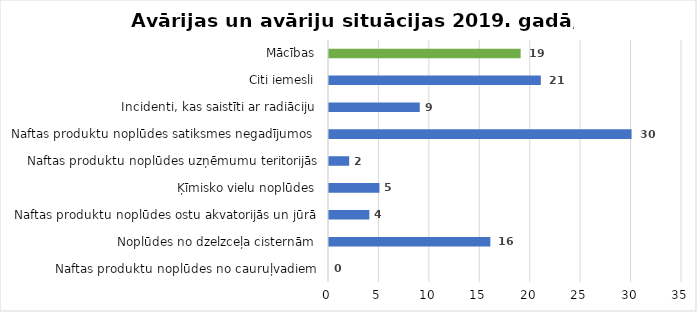
| Category | Series 0 |
|---|---|
| Naftas produktu noplūdes no cauruļvadiem | 0 |
| Noplūdes no dzelzceļa cisternām | 16 |
| Naftas produktu noplūdes ostu akvatorijās un jūrā | 4 |
| Ķīmisko vielu noplūdes | 5 |
| Naftas produktu noplūdes uzņēmumu teritorijās | 2 |
| Naftas produktu noplūdes satiksmes negadījumos  | 30 |
| Incidenti, kas saistīti ar radiāciju | 9 |
| Citi iemesli | 21 |
| Mācības | 19 |